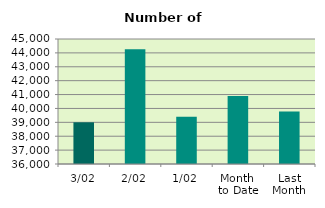
| Category | Series 0 |
|---|---|
| 3/02 | 39002 |
| 2/02 | 44266 |
| 1/02 | 39408 |
| Month 
to Date | 40892 |
| Last
Month | 39786.667 |